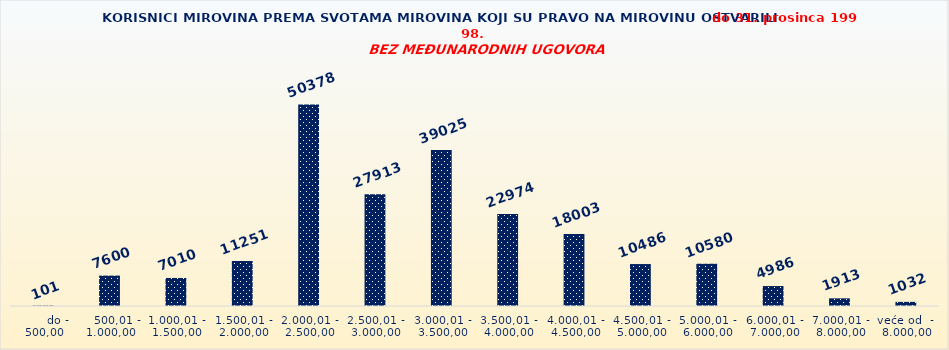
| Category | Series 0 |
|---|---|
|       do - 500,00 | 101 |
|    500,01 - 1.000,00 | 7600 |
| 1.000,01 - 1.500,00 | 7010 |
| 1.500,01 - 2.000,00 | 11251 |
| 2.000,01 - 2.500,00 | 50378 |
| 2.500,01 - 3.000,00 | 27913 |
| 3.000,01 - 3.500,00 | 39025 |
| 3.500,01 - 4.000,00 | 22974 |
| 4.000,01 - 4.500,00 | 18003 |
| 4.500,01 - 5.000,00 | 10486 |
| 5.000,01 - 6.000,00 | 10580 |
| 6.000,01 - 7.000,00 | 4986 |
| 7.000,01 - 8.000,00 | 1913 |
| veće od  -  8.000,00 | 1032 |